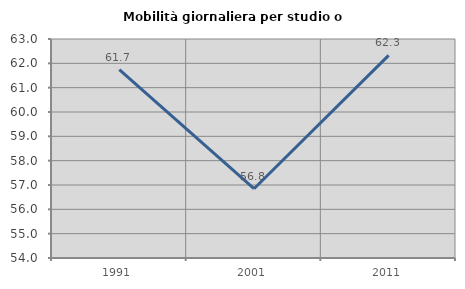
| Category | Mobilità giornaliera per studio o lavoro |
|---|---|
| 1991.0 | 61.743 |
| 2001.0 | 56.847 |
| 2011.0 | 62.328 |